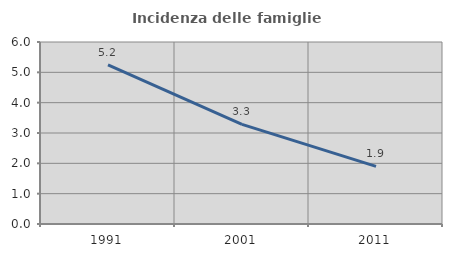
| Category | Incidenza delle famiglie numerose |
|---|---|
| 1991.0 | 5.245 |
| 2001.0 | 3.284 |
| 2011.0 | 1.898 |